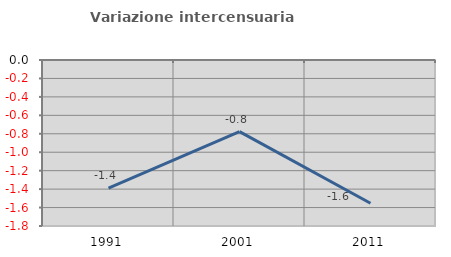
| Category | Variazione intercensuaria annua |
|---|---|
| 1991.0 | -1.389 |
| 2001.0 | -0.777 |
| 2011.0 | -1.553 |